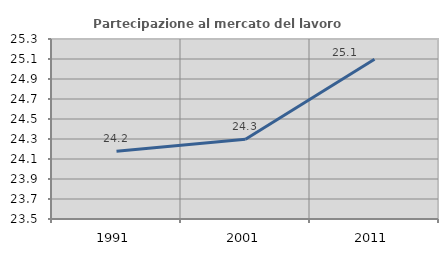
| Category | Partecipazione al mercato del lavoro  femminile |
|---|---|
| 1991.0 | 24.178 |
| 2001.0 | 24.298 |
| 2011.0 | 25.098 |